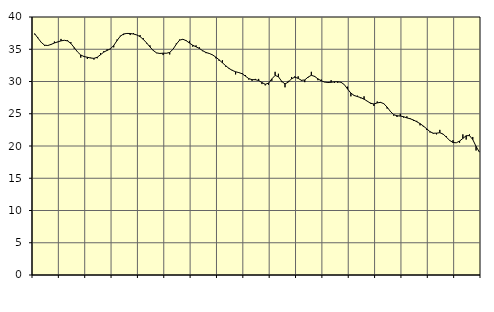
| Category | Piggar | Series 1 |
|---|---|---|
| nan | 37.3 | 37.42 |
| 87.0 | 36.8 | 36.73 |
| 87.0 | 36.1 | 36.07 |
| 87.0 | 35.5 | 35.63 |
| nan | 35.6 | 35.58 |
| 88.0 | 35.7 | 35.75 |
| 88.0 | 36.2 | 35.97 |
| 88.0 | 36.1 | 36.14 |
| nan | 36.6 | 36.3 |
| 89.0 | 36.4 | 36.39 |
| 89.0 | 36.4 | 36.29 |
| 89.0 | 36.1 | 35.9 |
| nan | 35.1 | 35.26 |
| 90.0 | 34.6 | 34.59 |
| 90.0 | 33.7 | 34.11 |
| 90.0 | 33.8 | 33.87 |
| nan | 33.5 | 33.76 |
| 91.0 | 33.7 | 33.64 |
| 91.0 | 33.4 | 33.59 |
| 91.0 | 33.6 | 33.76 |
| nan | 34.4 | 34.15 |
| 92.0 | 34.7 | 34.56 |
| 92.0 | 35 | 34.82 |
| 92.0 | 35 | 35.07 |
| nan | 35.3 | 35.58 |
| 93.0 | 36.5 | 36.34 |
| 93.0 | 37.1 | 37.02 |
| 93.0 | 37.2 | 37.37 |
| nan | 37.5 | 37.45 |
| 94.0 | 37.2 | 37.44 |
| 94.0 | 37.5 | 37.36 |
| 94.0 | 37.2 | 37.22 |
| nan | 37.2 | 36.96 |
| 95.0 | 36.7 | 36.52 |
| 95.0 | 35.9 | 35.98 |
| 95.0 | 35.6 | 35.36 |
| nan | 34.9 | 34.81 |
| 96.0 | 34.4 | 34.44 |
| 96.0 | 34.4 | 34.35 |
| 96.0 | 34.1 | 34.39 |
| nan | 34.4 | 34.38 |
| 97.0 | 34.2 | 34.51 |
| 97.0 | 35 | 35 |
| 97.0 | 35.9 | 35.78 |
| nan | 36.5 | 36.41 |
| 98.0 | 36.5 | 36.55 |
| 98.0 | 36.4 | 36.33 |
| 98.0 | 36.3 | 35.96 |
| nan | 35.4 | 35.62 |
| 99.0 | 35.6 | 35.38 |
| 99.0 | 35.3 | 35.12 |
| 99.0 | 34.7 | 34.78 |
| nan | 34.4 | 34.5 |
| 0.0 | 34.3 | 34.35 |
| 0.0 | 34.1 | 34.13 |
| 0.0 | 33.6 | 33.78 |
| nan | 33.2 | 33.36 |
| 1.0 | 33.3 | 32.9 |
| 1.0 | 32.3 | 32.44 |
| 1.0 | 32.1 | 32.03 |
| nan | 31.8 | 31.72 |
| 2.0 | 31.1 | 31.51 |
| 2.0 | 31.4 | 31.38 |
| 2.0 | 31.3 | 31.2 |
| nan | 31 | 30.83 |
| 3.0 | 30.3 | 30.45 |
| 3.0 | 30.1 | 30.29 |
| 3.0 | 30.4 | 30.28 |
| nan | 30.4 | 30.15 |
| 4.0 | 29.6 | 29.84 |
| 4.0 | 29.4 | 29.57 |
| 4.0 | 29.5 | 29.74 |
| nan | 30.1 | 30.4 |
| 5.0 | 31.5 | 30.94 |
| 5.0 | 31.2 | 30.74 |
| 5.0 | 29.9 | 30.02 |
| nan | 29.1 | 29.63 |
| 6.0 | 30.1 | 29.9 |
| 6.0 | 30.7 | 30.43 |
| 6.0 | 30.8 | 30.67 |
| nan | 30.8 | 30.48 |
| 7.0 | 30.1 | 30.18 |
| 7.0 | 29.9 | 30.24 |
| 7.0 | 30.6 | 30.68 |
| nan | 31.5 | 30.96 |
| 8.0 | 30.7 | 30.79 |
| 8.0 | 30.2 | 30.41 |
| 8.0 | 30.3 | 30.1 |
| nan | 29.9 | 29.92 |
| 9.0 | 29.9 | 29.84 |
| 9.0 | 30.2 | 29.88 |
| 9.0 | 29.8 | 29.95 |
| nan | 29.8 | 29.96 |
| 10.0 | 29.9 | 29.88 |
| 10.0 | 29.5 | 29.52 |
| 10.0 | 29.2 | 28.83 |
| nan | 27.7 | 28.2 |
| 11.0 | 27.9 | 27.83 |
| 11.0 | 27.8 | 27.66 |
| 11.0 | 27.4 | 27.5 |
| nan | 27.7 | 27.26 |
| 12.0 | 26.9 | 26.95 |
| 12.0 | 26.7 | 26.61 |
| 12.0 | 26.2 | 26.52 |
| nan | 26.9 | 26.68 |
| 13.0 | 26.7 | 26.77 |
| 13.0 | 26.6 | 26.56 |
| 13.0 | 25.8 | 26.03 |
| nan | 25.3 | 25.36 |
| 14.0 | 24.7 | 24.86 |
| 14.0 | 24.5 | 24.69 |
| 14.0 | 25 | 24.64 |
| nan | 24.4 | 24.54 |
| 15.0 | 24.6 | 24.36 |
| 15.0 | 24.3 | 24.22 |
| 15.0 | 23.9 | 24.03 |
| nan | 23.9 | 23.76 |
| 16.0 | 23.2 | 23.47 |
| 16.0 | 23 | 23.1 |
| 16.0 | 22.5 | 22.67 |
| nan | 22.1 | 22.23 |
| 17.0 | 21.9 | 21.98 |
| 17.0 | 21.8 | 21.99 |
| 17.0 | 22.5 | 22.06 |
| nan | 21.8 | 21.85 |
| 18.0 | 21.5 | 21.36 |
| 18.0 | 20.9 | 20.86 |
| 18.0 | 20.9 | 20.54 |
| nan | 20.5 | 20.5 |
| 19.0 | 20.5 | 20.76 |
| 19.0 | 21.8 | 21.18 |
| 19.0 | 21 | 21.59 |
| nan | 21.8 | 21.62 |
| 20.0 | 21.4 | 21 |
| 20.0 | 19.3 | 19.94 |
| 20.0 | 19.1 | 19.06 |